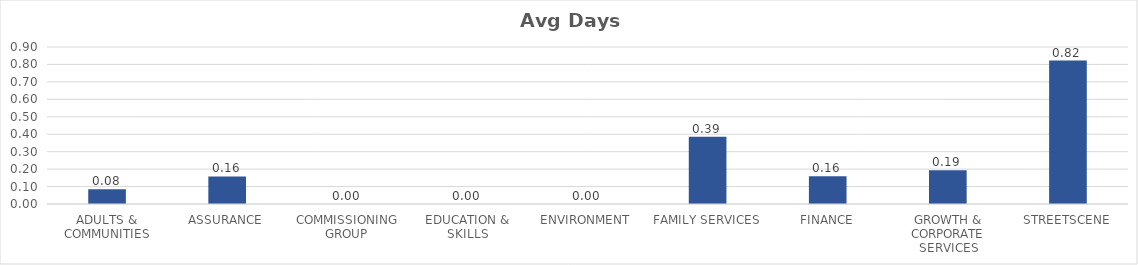
| Category | Avg Days Lost/FTE |
|---|---|
| ADULTS & COMMUNITIES | 0.085 |
| ASSURANCE | 0.158 |
| COMMISSIONING GROUP | 0 |
| EDUCATION & SKILLS | 0 |
| ENVIRONMENT | 0 |
| FAMILY SERVICES | 0.385 |
| FINANCE | 0.159 |
| GROWTH & CORPORATE SERVICES | 0.193 |
| STREETSCENE | 0.822 |